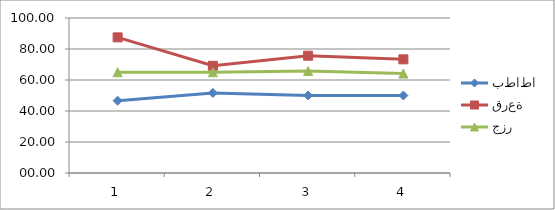
| Category | بطاطا | قرعة | جزر |
|---|---|---|---|
| 0 | 46.67 | 87.5 | 65 |
| 1 | 51.67 | 69.17 | 65 |
| 2 | 50 | 75.67 | 65.83 |
| 3 | 50 | 73.33 | 64.17 |